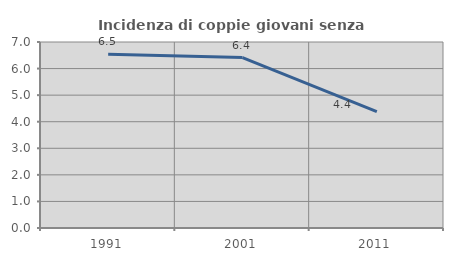
| Category | Incidenza di coppie giovani senza figli |
|---|---|
| 1991.0 | 6.537 |
| 2001.0 | 6.414 |
| 2011.0 | 4.381 |